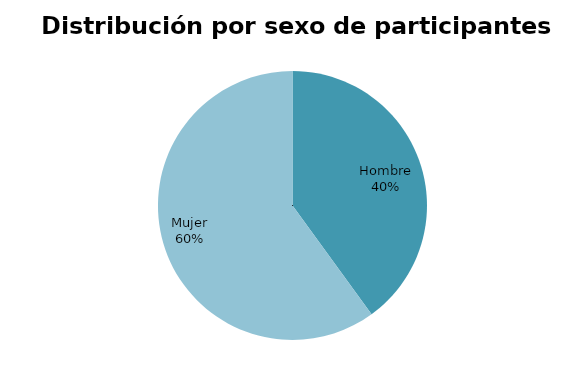
| Category | Series 0 |
|---|---|
| Hombre | 4 |
| Mujer | 6 |